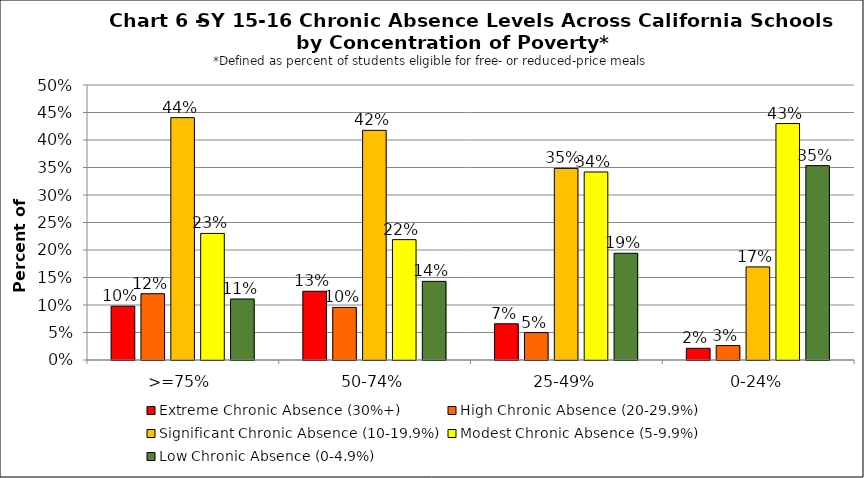
| Category | Extreme Chronic Absence (30%+) | High Chronic Absence (20-29.9%) | Significant Chronic Absence (10-19.9%) | Modest Chronic Absence (5-9.9%) | Low Chronic Absence (0-4.9%) |
|---|---|---|---|---|---|
| 0 | 0.098 | 0.12 | 0.441 | 0.23 | 0.111 |
| 1 | 0.125 | 0.096 | 0.418 | 0.219 | 0.143 |
| 2 | 0.066 | 0.05 | 0.348 | 0.342 | 0.194 |
| 3 | 0.021 | 0.026 | 0.169 | 0.43 | 0.353 |